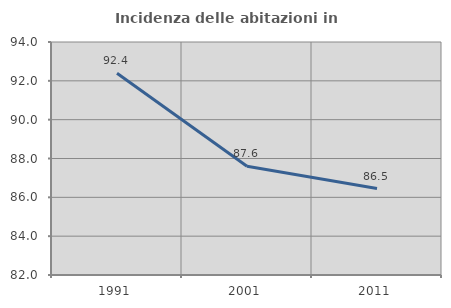
| Category | Incidenza delle abitazioni in proprietà  |
|---|---|
| 1991.0 | 92.387 |
| 2001.0 | 87.598 |
| 2011.0 | 86.454 |